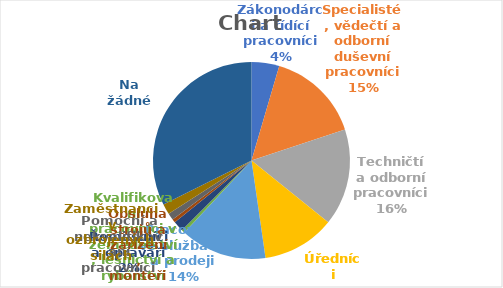
| Category | Series 0 |
|---|---|
| Zákonodárci a řídící pracovníci | 8 |
| Specialisté, vědečtí a odborní duševní pracovníci | 27 |
| Techničtí a odborní pracovníci | 28 |
| Úředníci | 21 |
| Pracovníci ve službách a prodeji | 25 |
| Kvalifikovaní pracovníci v zemědělství, lesnictví a rybářství | 1 |
| Řemeslníci a opraváři | 3 |
| Obsluha strojů a zařízení, montéři | 1 |
| Pomocní a nekvalifikovaní pracovníci | 2 |
| Zaměstnanci v ozbrojených silách | 3 |
| Na žádné | 57 |